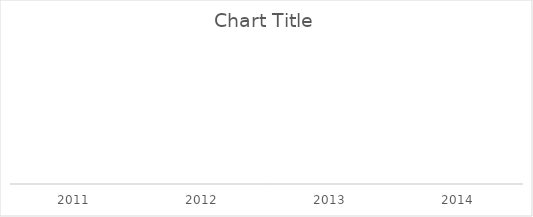
| Category | CA  | CA EXPORT  |
|---|---|---|
| 2011.0 | 0 | 0 |
| 2012.0 | 0 | 0 |
| 2013.0 | 0 | 0 |
| 2014.0 | 0 | 0 |